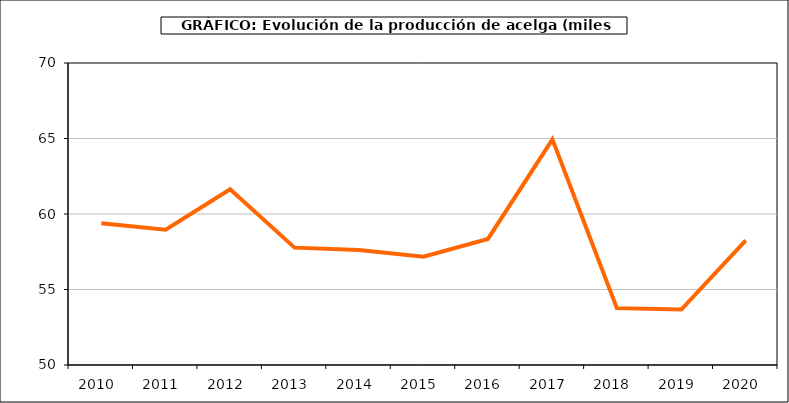
| Category | producción |
|---|---|
| 2010.0 | 59.386 |
| 2011.0 | 58.965 |
| 2012.0 | 61.638 |
| 2013.0 | 57.773 |
| 2014.0 | 57.619 |
| 2015.0 | 57.168 |
| 2016.0 | 58.349 |
| 2017.0 | 64.944 |
| 2018.0 | 53.766 |
| 2019.0 | 53.672 |
| 2020.0 | 58.257 |